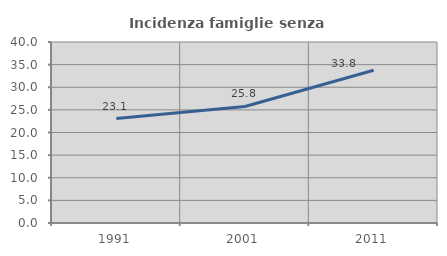
| Category | Incidenza famiglie senza nuclei |
|---|---|
| 1991.0 | 23.093 |
| 2001.0 | 25.751 |
| 2011.0 | 33.756 |